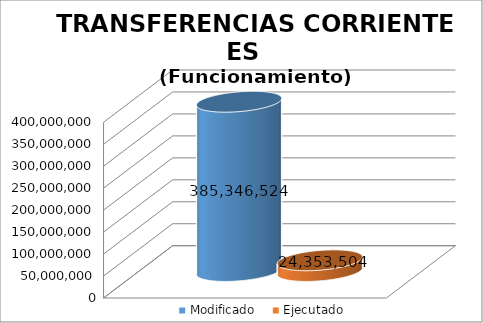
| Category | Modificado | Ejecutado |
|---|---|---|
| 0 | 385346524 | 24353504.16 |